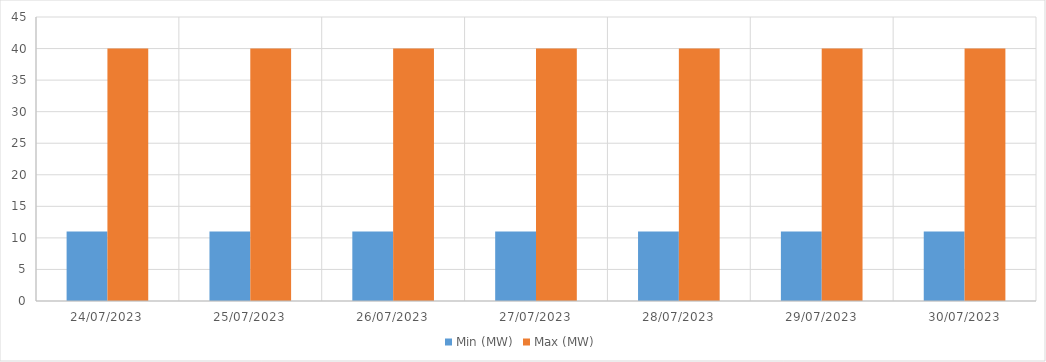
| Category | Min (MW) | Max (MW) |
|---|---|---|
| 24/07/2023 | 11 | 40 |
| 25/07/2023 | 11 | 40 |
| 26/07/2023 | 11 | 40 |
| 27/07/2023 | 11 | 40 |
| 28/07/2023 | 11 | 40 |
| 29/07/2023 | 11 | 40 |
| 30/07/2023 | 11 | 40 |